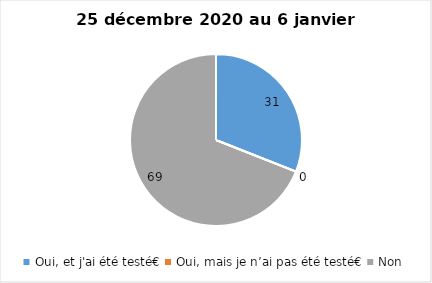
| Category | Series 0 |
|---|---|
| Oui, et j'ai été testé€ | 31 |
| Oui, mais je n’ai pas été testé€ | 0 |
| Non | 69 |